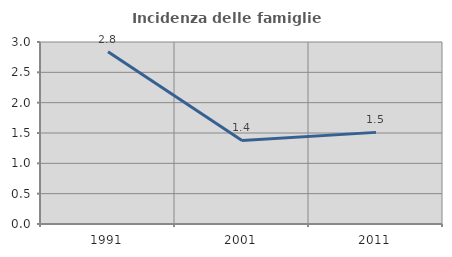
| Category | Incidenza delle famiglie numerose |
|---|---|
| 1991.0 | 2.838 |
| 2001.0 | 1.378 |
| 2011.0 | 1.51 |